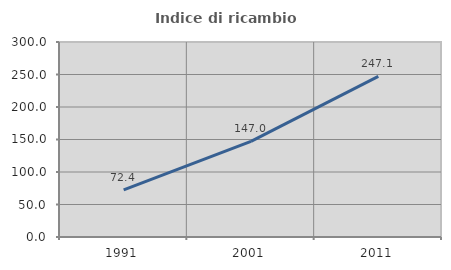
| Category | Indice di ricambio occupazionale  |
|---|---|
| 1991.0 | 72.381 |
| 2001.0 | 146.988 |
| 2011.0 | 247.059 |